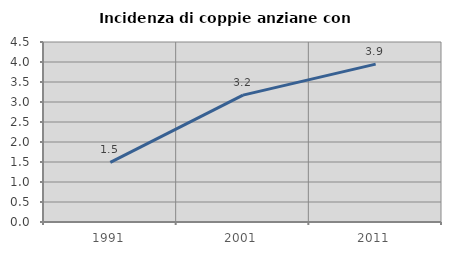
| Category | Incidenza di coppie anziane con figli |
|---|---|
| 1991.0 | 1.49 |
| 2001.0 | 3.172 |
| 2011.0 | 3.947 |